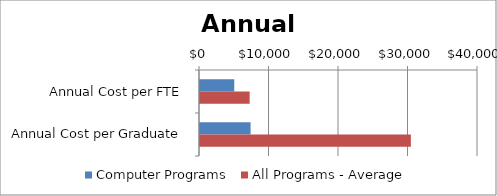
| Category | Computer Programs | All Programs - Average |
|---|---|---|
| Annual Cost per FTE | 4927.012 | 7144 |
| Annual Cost per Graduate | 7276.817 | 30340 |